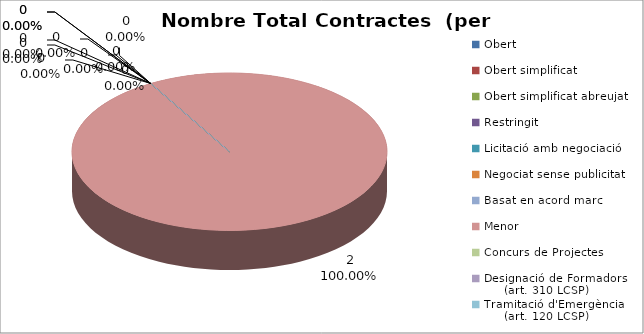
| Category | Nombre Total Contractes |
|---|---|
| Obert | 0 |
| Obert simplificat | 0 |
| Obert simplificat abreujat | 0 |
| Restringit | 0 |
| Licitació amb negociació | 0 |
| Negociat sense publicitat | 0 |
| Basat en acord marc | 0 |
| Menor | 2 |
| Concurs de Projectes | 0 |
| Designació de Formadors
     (art. 310 LCSP) | 0 |
| Tramitació d'Emergència
     (art. 120 LCSP) | 0 |